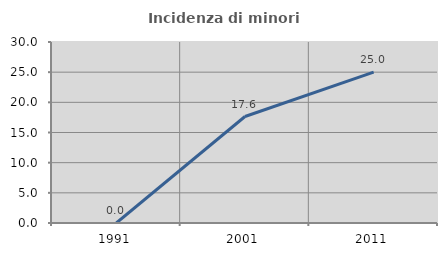
| Category | Incidenza di minori stranieri |
|---|---|
| 1991.0 | 0 |
| 2001.0 | 17.647 |
| 2011.0 | 25 |